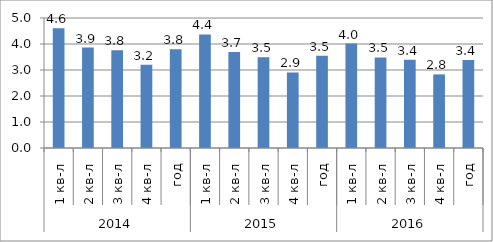
| Category | Series 0 |
|---|---|
| 0 | 4.604 |
| 1 | 3.863 |
| 2 | 3.762 |
| 3 | 3.202 |
| 4 | 3.8 |
| 5 | 4.366 |
| 6 | 3.689 |
| 7 | 3.49 |
| 8 | 2.906 |
| 9 | 3.546 |
| 10 | 4.018 |
| 11 | 3.484 |
| 12 | 3.393 |
| 13 | 2.831 |
| 14 | 3.386 |